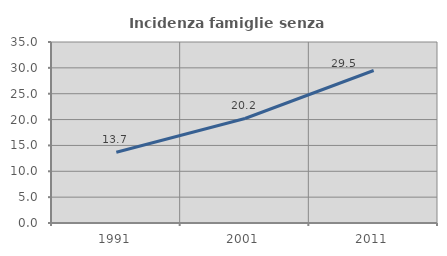
| Category | Incidenza famiglie senza nuclei |
|---|---|
| 1991.0 | 13.69 |
| 2001.0 | 20.208 |
| 2011.0 | 29.493 |